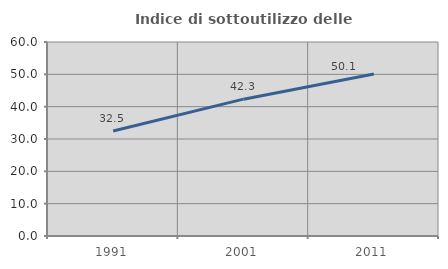
| Category | Indice di sottoutilizzo delle abitazioni  |
|---|---|
| 1991.0 | 32.475 |
| 2001.0 | 42.323 |
| 2011.0 | 50.127 |